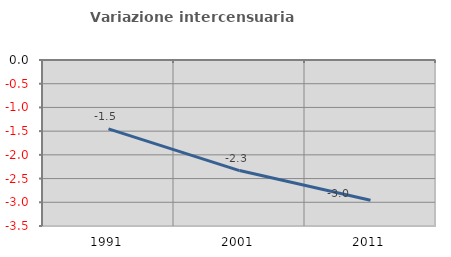
| Category | Variazione intercensuaria annua |
|---|---|
| 1991.0 | -1.453 |
| 2001.0 | -2.331 |
| 2011.0 | -2.955 |